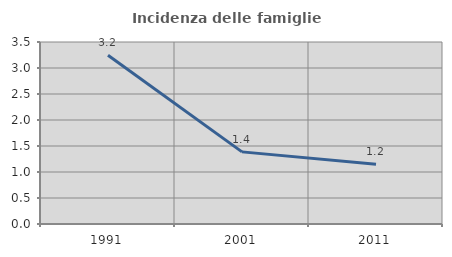
| Category | Incidenza delle famiglie numerose |
|---|---|
| 1991.0 | 3.244 |
| 2001.0 | 1.387 |
| 2011.0 | 1.151 |